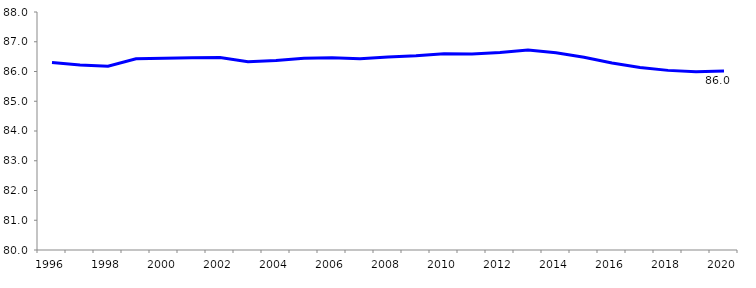
| Category | Part du Public |
|---|---|
| 1996.0 | 86.304 |
| 1997.0 | 86.216 |
| 1998.0 | 86.175 |
| 1999.0 | 86.431 |
| 2000.0 | 86.446 |
| 2001.0 | 86.464 |
| 2002.0 | 86.467 |
| 2003.0 | 86.328 |
| 2004.0 | 86.373 |
| 2005.0 | 86.442 |
| 2006.0 | 86.46 |
| 2007.0 | 86.432 |
| 2008.0 | 86.491 |
| 2009.0 | 86.529 |
| 2010.0 | 86.595 |
| 2011.0 | 86.59 |
| 2012.0 | 86.635 |
| 2013.0 | 86.726 |
| 2014.0 | 86.629 |
| 2015.0 | 86.481 |
| 2016.0 | 86.283 |
| 2017.0 | 86.134 |
| 2018.0 | 86.038 |
| 2019.0 | 85.995 |
| 2020.0 | 86.018 |